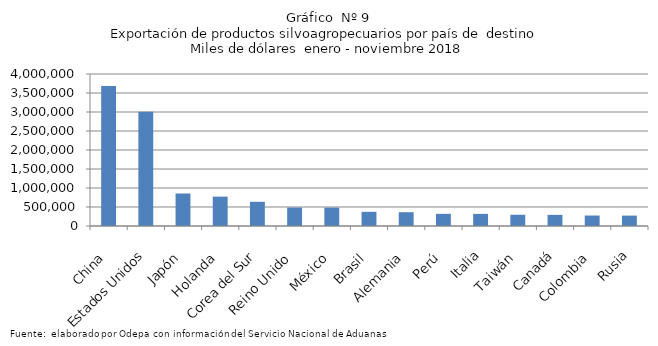
| Category | Series 0 |
|---|---|
| China | 3681486.657 |
| Estados Unidos | 3005631.13 |
| Japón | 855014.905 |
| Holanda | 772802.414 |
| Corea del Sur | 636740.094 |
| Reino Unido | 485718.326 |
| México | 483028.462 |
| Brasil | 372891.459 |
| Alemania | 363112.103 |
| Perú | 320138.89 |
| Italia | 318975.618 |
| Taiwán | 295318.81 |
| Canadá | 293229.191 |
| Colombia | 275506.462 |
| Rusia | 273772.549 |